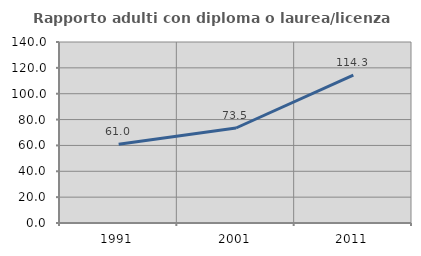
| Category | Rapporto adulti con diploma o laurea/licenza media  |
|---|---|
| 1991.0 | 60.976 |
| 2001.0 | 73.483 |
| 2011.0 | 114.324 |